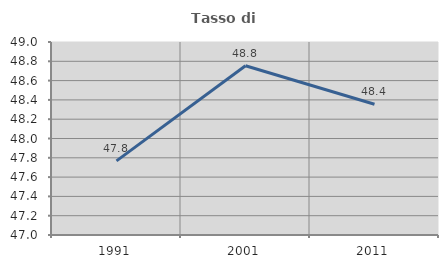
| Category | Tasso di occupazione   |
|---|---|
| 1991.0 | 47.768 |
| 2001.0 | 48.754 |
| 2011.0 | 48.355 |